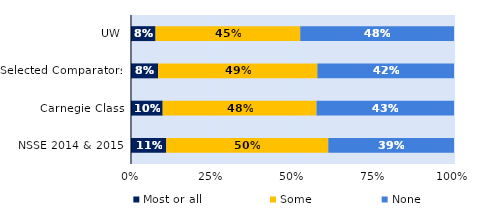
| Category | Most or all | Some | None |
|---|---|---|---|
| UW | 0.076 | 0.448 | 0.476 |
| Selected Comparators | 0.084 | 0.493 | 0.423 |
| Carnegie Class | 0.098 | 0.476 | 0.426 |
| NSSE 2014 & 2015 | 0.109 | 0.502 | 0.389 |